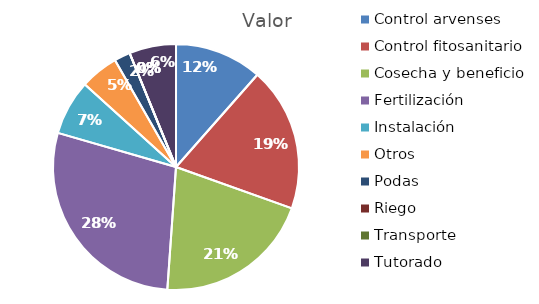
| Category | Valor |
|---|---|
| Control arvenses | 4380132 |
| Control fitosanitario | 7217964 |
| Cosecha y beneficio | 7872000 |
| Fertilización | 10796100 |
| Instalación | 2758924 |
| Otros | 1912452 |
| Podas | 801996 |
| Riego | 0 |
| Transporte | 0 |
| Tutorado | 2344296 |